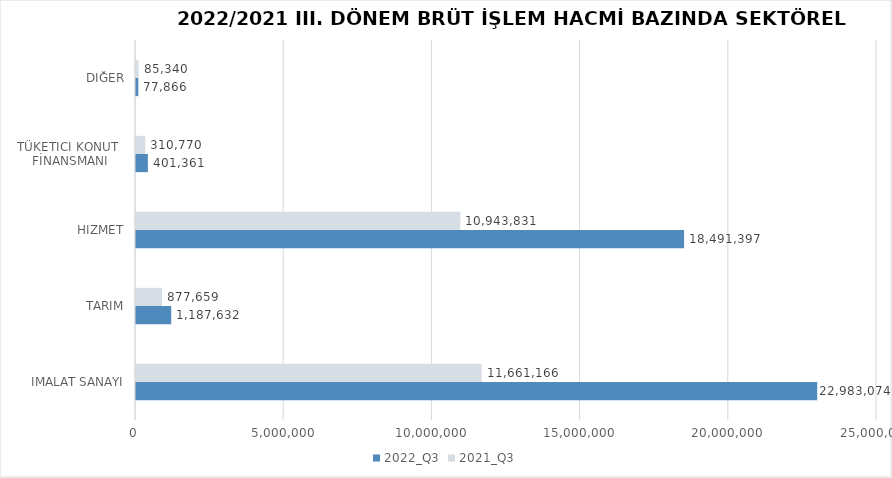
| Category | 2022_Q3 | 2021_Q3 |
|---|---|---|
| İMALAT SANAYİ | 22983073.606 | 11661165.52 |
| TARIM | 1187632.025 | 877659.164 |
| HİZMET | 18491397.437 | 10943830.592 |
| TÜKETİCİ KONUT 
FİNANSMANI | 401361 | 310770 |
| DİĞER | 77866 | 85340 |